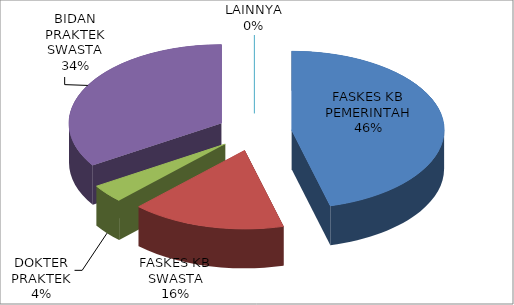
| Category | Series 0 |
|---|---|
| FASKES KB PEMERINTAH | 45.91 |
| FASKES KB SWASTA | 16.34 |
| DOKTER PRAKTEK | 3.73 |
| BIDAN PRAKTEK SWASTA | 34.01 |
| LAINNYA | 0 |